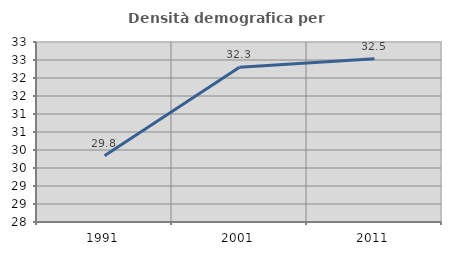
| Category | Densità demografica |
|---|---|
| 1991.0 | 29.839 |
| 2001.0 | 32.301 |
| 2011.0 | 32.536 |